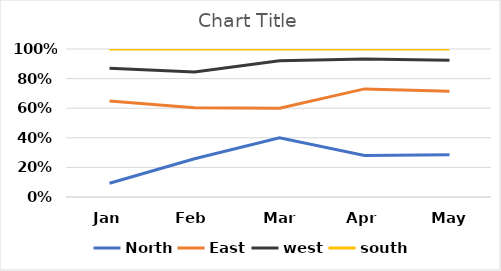
| Category | North | East | west | south |
|---|---|---|---|---|
| Jan | 500 | 3000 | 1200 | 700 |
| Feb | 1500 | 2000 | 1400 | 900 |
| Mar | 2000 | 1000 | 1600 | 400 |
| Apr | 2500 | 4000 | 1800 | 600 |
| May | 3000 | 4500 | 2200 | 800 |